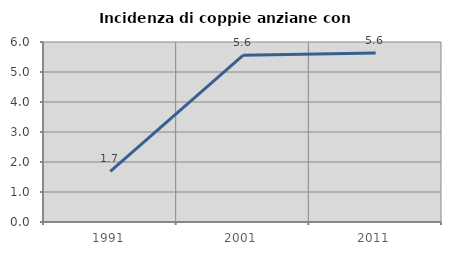
| Category | Incidenza di coppie anziane con figli |
|---|---|
| 1991.0 | 1.688 |
| 2001.0 | 5.556 |
| 2011.0 | 5.634 |